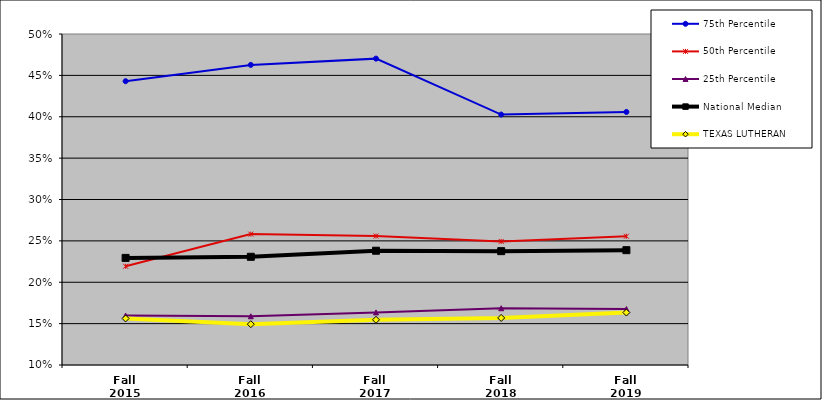
| Category | 75th Percentile | 50th Percentile | 25th Percentile | National Median | TEXAS LUTHERAN |
|---|---|---|---|---|---|
| Fall 2015 | 0.443 | 0.219 | 0.16 | 0.229 | 0.156 |
| Fall 2016 | 0.463 | 0.258 | 0.159 | 0.231 | 0.149 |
| Fall 2017 | 0.47 | 0.256 | 0.164 | 0.238 | 0.155 |
| Fall 2018 | 0.403 | 0.249 | 0.169 | 0.238 | 0.157 |
| Fall 2019 | 0.406 | 0.256 | 0.168 | 0.239 | 0.163 |